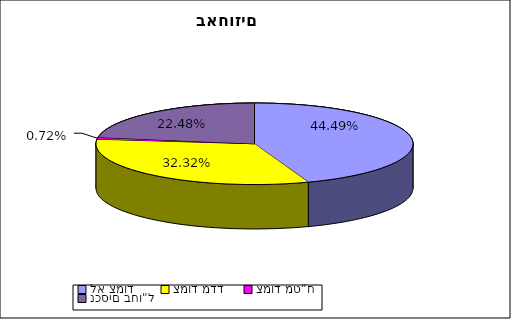
| Category | Series 1 |
|---|---|
| לא צמוד | 0.445 |
| צמוד מדד | 0.323 |
| צמוד מט"ח | 0.007 |
| נכסים בחו"ל | 0.225 |